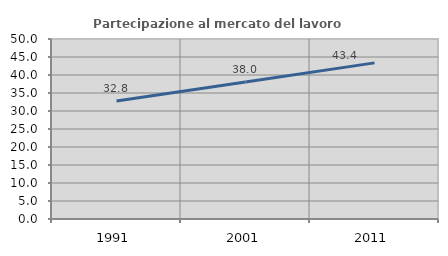
| Category | Partecipazione al mercato del lavoro  femminile |
|---|---|
| 1991.0 | 32.757 |
| 2001.0 | 38.048 |
| 2011.0 | 43.366 |